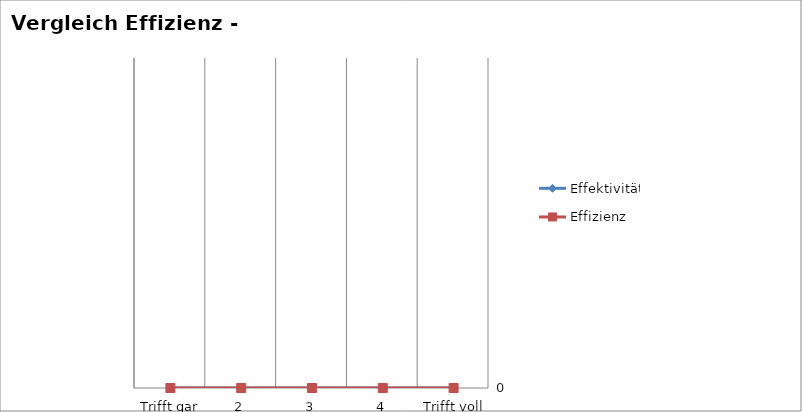
| Category | Effektivität | Effizienz |
|---|---|---|
| Trifft gar nicht zu 1 | 0 | 0 |
| 2 | 0 | 0 |
| 3 | 0 | 0 |
| 4 | 0 | 0 |
| Trifft voll zu 5 | 0 | 0 |